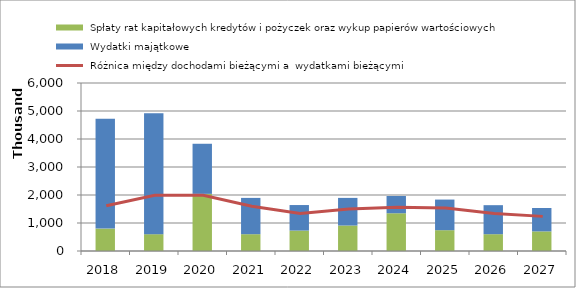
| Category |  Spłaty rat kapitałowych kredytów i pożyczek oraz wykup papierów wartościowych |  Wydatki majątkowe |
|---|---|---|
| 2018.0 | 800000 | 3926252 |
| 2019.0 | 600000 | 4316400 |
| 2020.0 | 2040000 | 1789844 |
| 2021.0 | 600000 | 1296481 |
| 2022.0 | 730000 | 911426 |
| 2023.0 | 910000 | 986559 |
| 2024.0 | 1348000 | 615945 |
| 2025.0 | 743000 | 1093654 |
| 2026.0 | 600000 | 1036654 |
| 2027.0 | 700000 | 836654 |